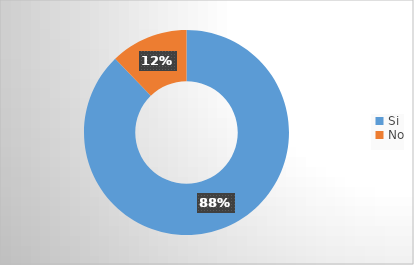
| Category | Series 0 |
|---|---|
| Si | 0.878 |
| No | 0.122 |